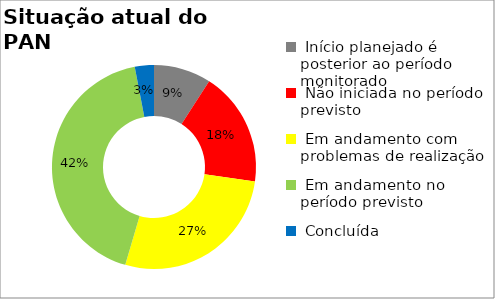
| Category | Series 0 |
|---|---|
|  Início planejado é posterior ao período monitorado | 0.091 |
|  Não iniciada no período previsto | 0.182 |
|  Em andamento com problemas de realização | 0.273 |
|  Em andamento no período previsto  | 0.424 |
|  Concluída | 0.03 |